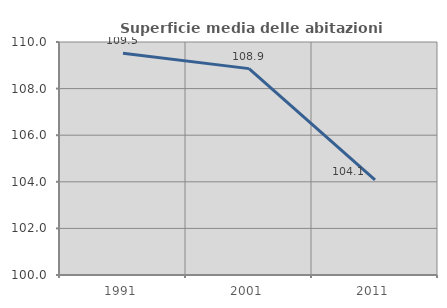
| Category | Superficie media delle abitazioni occupate |
|---|---|
| 1991.0 | 109.52 |
| 2001.0 | 108.858 |
| 2011.0 | 104.086 |